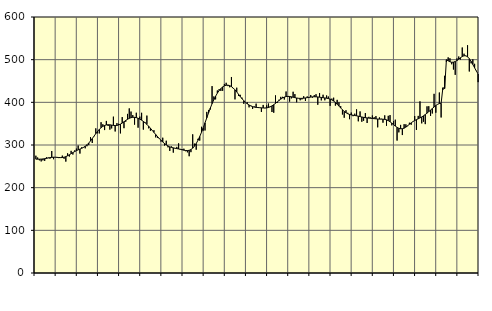
| Category | Piggar | Series 1 |
|---|---|---|
| nan | 274.9 | 266.76 |
| 1.0 | 270.7 | 266.76 |
| 1.0 | 264.1 | 266.82 |
| 1.0 | 261.5 | 266.96 |
| 1.0 | 264 | 267.32 |
| 1.0 | 262.8 | 267.86 |
| 1.0 | 271.2 | 268.57 |
| 1.0 | 270.6 | 269.52 |
| 1.0 | 268 | 270.36 |
| 1.0 | 285.9 | 271.01 |
| 1.0 | 266.7 | 271.34 |
| 1.0 | 271.1 | 271.36 |
| nan | 270.4 | 271.1 |
| 2.0 | 269.3 | 270.68 |
| 2.0 | 271.1 | 270.42 |
| 2.0 | 275.1 | 270.6 |
| 2.0 | 267.8 | 271.37 |
| 2.0 | 261.1 | 272.78 |
| 2.0 | 280.5 | 274.76 |
| 2.0 | 273 | 277.16 |
| 2.0 | 286.3 | 279.71 |
| 2.0 | 277.6 | 282.25 |
| 2.0 | 287.2 | 284.6 |
| 2.0 | 291.5 | 286.7 |
| nan | 298.7 | 288.58 |
| 3.0 | 279.9 | 290.39 |
| 3.0 | 294.8 | 292.26 |
| 3.0 | 295 | 294.38 |
| 3.0 | 292.2 | 297.07 |
| 3.0 | 297.1 | 300.49 |
| 3.0 | 299.8 | 304.65 |
| 3.0 | 318.4 | 309.52 |
| 3.0 | 304.8 | 315.02 |
| 3.0 | 320.2 | 320.77 |
| 3.0 | 339 | 326.52 |
| 3.0 | 327.5 | 331.91 |
| nan | 327.1 | 336.63 |
| 4.0 | 353.4 | 340.6 |
| 4.0 | 348.6 | 343.68 |
| 4.0 | 335 | 345.82 |
| 4.0 | 356.4 | 347.07 |
| 4.0 | 344.6 | 347.5 |
| 4.0 | 336 | 347.3 |
| 4.0 | 338.9 | 346.66 |
| 4.0 | 366.4 | 345.93 |
| 4.0 | 331.7 | 345.59 |
| 4.0 | 351.3 | 345.84 |
| 4.0 | 349.6 | 346.94 |
| nan | 327.2 | 348.92 |
| 5.0 | 365.4 | 351.48 |
| 5.0 | 339.4 | 354.41 |
| 5.0 | 354.5 | 357.47 |
| 5.0 | 372.9 | 360.26 |
| 5.0 | 385.8 | 362.48 |
| 5.0 | 378.4 | 364.04 |
| 5.0 | 370.1 | 364.9 |
| 5.0 | 347.7 | 364.9 |
| 5.0 | 375.6 | 364.09 |
| 5.0 | 340.6 | 362.66 |
| 5.0 | 366.5 | 360.66 |
| nan | 375.5 | 358.22 |
| 6.0 | 336.1 | 355.36 |
| 6.0 | 353.4 | 352.04 |
| 6.0 | 368.9 | 348.28 |
| 6.0 | 339.1 | 344.04 |
| 6.0 | 333.3 | 339.4 |
| 6.0 | 334 | 334.5 |
| 6.0 | 334.7 | 329.5 |
| 6.0 | 317.9 | 324.62 |
| 6.0 | 316.8 | 319.93 |
| 6.0 | 316.4 | 315.39 |
| 6.0 | 308.1 | 311.11 |
| nan | 317.1 | 307.07 |
| 7.0 | 298.7 | 303.42 |
| 7.0 | 310 | 300.32 |
| 7.0 | 294.5 | 297.73 |
| 7.0 | 286.1 | 295.71 |
| 7.0 | 296.6 | 294.33 |
| 7.0 | 282.1 | 293.29 |
| 7.0 | 292.7 | 292.37 |
| 7.0 | 295.6 | 291.51 |
| 7.0 | 303.9 | 290.65 |
| 7.0 | 290.8 | 289.76 |
| 7.0 | 290.6 | 288.76 |
| nan | 291.3 | 287.78 |
| 8.0 | 285.4 | 287.1 |
| 8.0 | 282.8 | 286.96 |
| 8.0 | 273.7 | 287.58 |
| 8.0 | 283.2 | 289.35 |
| 8.0 | 325 | 292.53 |
| 8.0 | 303.2 | 297.2 |
| 8.0 | 289 | 303.42 |
| 8.0 | 314.5 | 311.05 |
| 8.0 | 310.3 | 319.9 |
| 8.0 | 342.7 | 329.81 |
| 8.0 | 333.6 | 340.63 |
| nan | 334 | 352.04 |
| 9.0 | 377.6 | 363.68 |
| 9.0 | 382.2 | 375.25 |
| 9.0 | 383.2 | 386.45 |
| 9.0 | 438 | 396.85 |
| 9.0 | 413.8 | 406.14 |
| 9.0 | 406.9 | 414.33 |
| 9.0 | 427.8 | 421.45 |
| 9.0 | 430.9 | 427.51 |
| 9.0 | 426.6 | 432.4 |
| 9.0 | 427 | 436.12 |
| 9.0 | 443 | 438.66 |
| nan | 445.8 | 440.07 |
| 10.0 | 438 | 440.26 |
| 10.0 | 435.3 | 439.14 |
| 10.0 | 459.4 | 436.83 |
| 10.0 | 432.9 | 433.5 |
| 10.0 | 406.9 | 429.27 |
| 10.0 | 434.3 | 424.32 |
| 10.0 | 415.1 | 418.98 |
| 10.0 | 417.6 | 413.55 |
| 10.0 | 410.9 | 408.44 |
| 10.0 | 396.5 | 403.85 |
| 10.0 | 399.8 | 399.89 |
| nan | 400.1 | 396.52 |
| 11.0 | 388.2 | 393.74 |
| 11.0 | 392.4 | 391.54 |
| 11.0 | 384.5 | 389.89 |
| 11.0 | 390.2 | 388.8 |
| 11.0 | 396.9 | 388.16 |
| 11.0 | 387.1 | 387.78 |
| 11.0 | 387 | 387.43 |
| 11.0 | 377.5 | 387.1 |
| 11.0 | 393.9 | 386.81 |
| 11.0 | 386.2 | 386.76 |
| 11.0 | 392.9 | 387.07 |
| nan | 397.2 | 387.9 |
| 12.0 | 390.7 | 389.4 |
| 12.0 | 377.3 | 391.64 |
| 12.0 | 375.6 | 394.47 |
| 12.0 | 416.2 | 397.66 |
| 12.0 | 398.5 | 401.02 |
| 12.0 | 406.1 | 404.36 |
| 12.0 | 412.8 | 407.5 |
| 12.0 | 412.9 | 410.23 |
| 12.0 | 406.6 | 412.3 |
| 12.0 | 425.4 | 413.56 |
| 12.0 | 412.5 | 414 |
| nan | 401.7 | 413.72 |
| 13.0 | 409.2 | 412.94 |
| 13.0 | 424.8 | 411.95 |
| 13.0 | 419.3 | 410.99 |
| 13.0 | 400.1 | 410.14 |
| 13.0 | 409.2 | 409.51 |
| 13.0 | 404.8 | 409.24 |
| 13.0 | 406.9 | 409.34 |
| 13.0 | 414.3 | 409.71 |
| 13.0 | 403.3 | 410.31 |
| 13.0 | 413.9 | 411 |
| 13.0 | 412.4 | 411.63 |
| nan | 417.2 | 412.27 |
| 14.0 | 411 | 412.8 |
| 14.0 | 416.9 | 413.02 |
| 14.0 | 419 | 412.92 |
| 14.0 | 394.3 | 412.59 |
| 14.0 | 421.9 | 412.09 |
| 14.0 | 404.5 | 411.47 |
| 14.0 | 417.8 | 410.85 |
| 14.0 | 404.7 | 410.3 |
| 14.0 | 416.1 | 409.69 |
| 14.0 | 413.6 | 408.84 |
| 14.0 | 391.7 | 407.55 |
| nan | 408.8 | 405.63 |
| 15.0 | 410.9 | 403 |
| 15.0 | 392.3 | 399.64 |
| 15.0 | 405.8 | 395.61 |
| 15.0 | 400.1 | 391.23 |
| 15.0 | 391.1 | 386.77 |
| 15.0 | 371.5 | 382.51 |
| 15.0 | 363.9 | 378.78 |
| 15.0 | 381.5 | 375.67 |
| 15.0 | 375.5 | 373.31 |
| 15.0 | 360.5 | 371.63 |
| 15.0 | 376 | 370.53 |
| nan | 367.5 | 369.8 |
| 16.0 | 373.4 | 369.14 |
| 16.0 | 383.6 | 368.38 |
| 16.0 | 355.5 | 367.57 |
| 16.0 | 378.7 | 366.63 |
| 16.0 | 354.5 | 365.64 |
| 16.0 | 356.8 | 364.77 |
| 16.0 | 374.8 | 364.05 |
| 16.0 | 351.6 | 363.51 |
| 16.0 | 366 | 363.04 |
| 16.0 | 364.5 | 362.57 |
| 16.0 | 369.2 | 362.15 |
| nan | 365.1 | 361.72 |
| 17.0 | 367.7 | 361.24 |
| 17.0 | 341.4 | 360.87 |
| 17.0 | 364.6 | 360.7 |
| 17.0 | 361.5 | 360.62 |
| 17.0 | 352.3 | 360.46 |
| 17.0 | 369.5 | 360 |
| 17.0 | 345.1 | 358.93 |
| 17.0 | 368.4 | 357.1 |
| 17.0 | 370.1 | 354.55 |
| 17.0 | 346 | 351.37 |
| 17.0 | 355.7 | 347.84 |
| nan | 359.3 | 344.3 |
| 18.0 | 310.4 | 341.29 |
| 18.0 | 329.6 | 339.21 |
| 18.0 | 347.1 | 338.12 |
| 18.0 | 323.3 | 338.14 |
| 18.0 | 348.8 | 339.42 |
| 18.0 | 348.5 | 341.9 |
| 18.0 | 344.1 | 345.13 |
| 18.0 | 352.2 | 348.59 |
| 18.0 | 347.4 | 351.88 |
| 18.0 | 354.6 | 354.87 |
| 18.0 | 367.9 | 357.36 |
| nan | 335.2 | 359.45 |
| 19.0 | 368.2 | 361.42 |
| 19.0 | 402.3 | 363.44 |
| 19.0 | 350.7 | 365.71 |
| 19.0 | 354.6 | 368.39 |
| 19.0 | 348.9 | 371.41 |
| 19.0 | 390.6 | 374.67 |
| 19.0 | 390.9 | 378.16 |
| 19.0 | 368.1 | 381.79 |
| 19.0 | 373.9 | 385.46 |
| 19.0 | 419.9 | 389.09 |
| 19.0 | 375.7 | 392.52 |
| nan | 394.9 | 395.34 |
| 20.0 | 423 | 397.15 |
| 20.0 | 364.5 | 397.59 |
| 20.0 | 429.1 | 434.21 |
| 20.0 | 462.2 | 432.33 |
| 20.0 | 494.7 | 499.78 |
| 20.0 | 505.4 | 497.2 |
| 20.0 | 503.3 | 495.04 |
| 20.0 | 489.2 | 493.94 |
| 20.0 | 476.9 | 494.17 |
| 20.0 | 464.4 | 495.6 |
| 20.0 | 502.9 | 497.98 |
| nan | 507.4 | 501.19 |
| 21.0 | 500.3 | 504.53 |
| 21.0 | 528.5 | 507.37 |
| 21.0 | 514 | 509.16 |
| 21.0 | 508.4 | 509.09 |
| 21.0 | 533.8 | 506.78 |
| 21.0 | 472.3 | 502.37 |
| 21.0 | 491.4 | 496.13 |
| 21.0 | 500.8 | 488.72 |
| 21.0 | 490.3 | 480.9 |
| 21.0 | 473.8 | 473.34 |
| 21.0 | 447.3 | 466.45 |